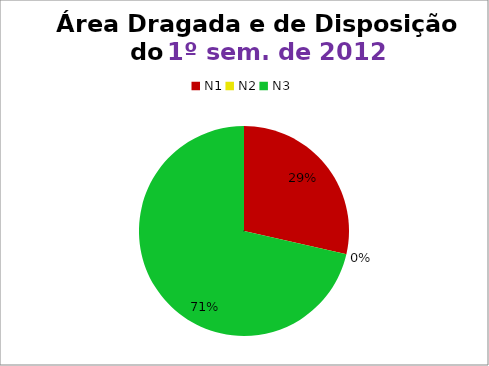
| Category | 1º/12 |
|---|---|
| N1 | 8 |
| N2 | 0 |
| N3 | 20 |